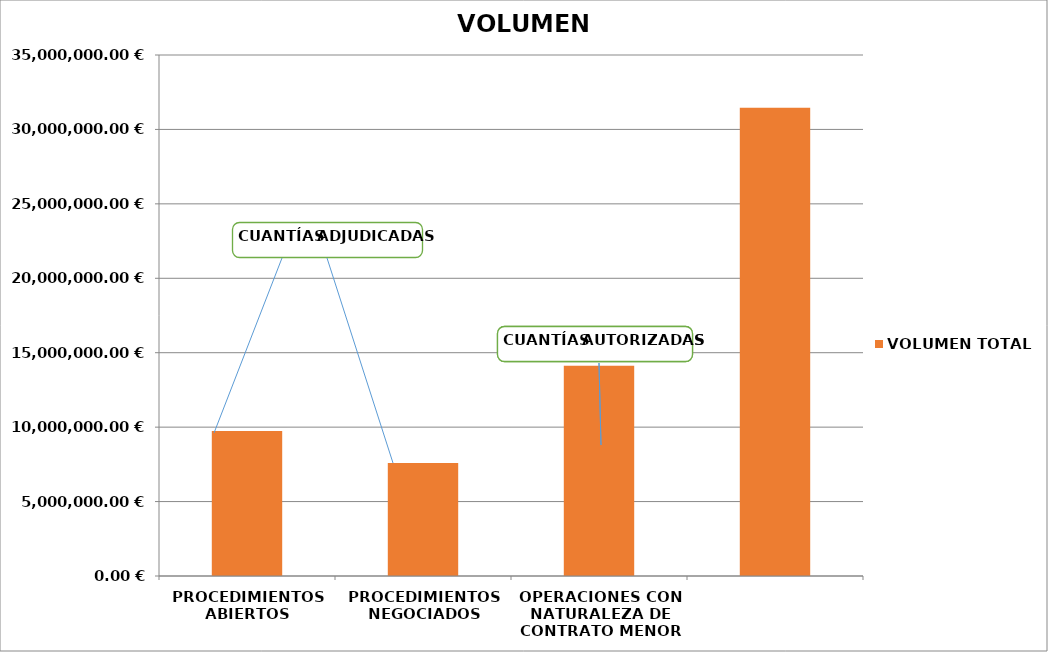
| Category | VOLUMEN TOTAL |
|---|---|
| PROCEDIMIENTOS ABIERTOS | 9739000.77 |
| PROCEDIMIENTOS NEGOCIADOS | 7587572.24 |
| OPERACIONES CON NATURALEZA DE CONTRATO MENOR | 14130824.91 |